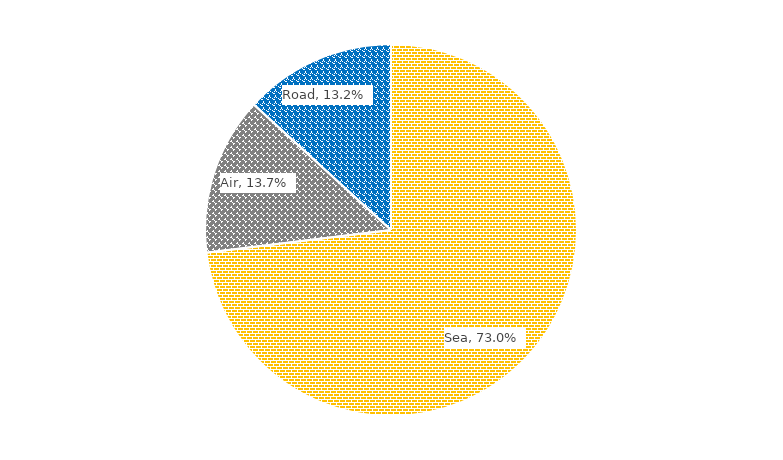
| Category | Series 1 |
|---|---|
| Sea | 0.73 |
| Air | 0.137 |
| Road | 0.132 |